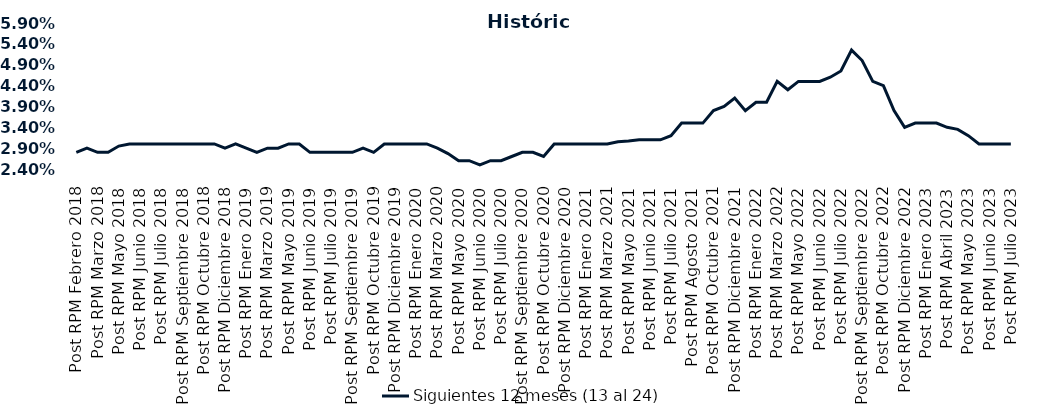
| Category | Siguientes 12 meses (13 al 24)  |
|---|---|
| Post RPM Febrero 2018 | 0.028 |
| Pre RPM Marzo 2018 | 0.029 |
| Post RPM Marzo 2018 | 0.028 |
| Pre RPM Mayo 2018 | 0.028 |
| Post RPM Mayo 2018 | 0.03 |
| Pre RPM Junio 2018 | 0.03 |
| Post RPM Junio 2018 | 0.03 |
| Pre RPM Julio 2018 | 0.03 |
| Post RPM Julio 2018 | 0.03 |
| Pre RPM Septiembre 2018 | 0.03 |
| Post RPM Septiembre 2018 | 0.03 |
| Pre RPM Octubre 2018 | 0.03 |
| Post RPM Octubre 2018 | 0.03 |
| Pre RPM Diciembre 2018 | 0.03 |
| Post RPM Diciembre 2018 | 0.029 |
| Pre RPM Enero 2019 | 0.03 |
| Post RPM Enero 2019 | 0.029 |
| Pre RPM Marzo 2019 | 0.028 |
| Post RPM Marzo 2019 | 0.029 |
| Pre RPM Mayo 2019 | 0.029 |
| Post RPM Mayo 2019 | 0.03 |
| Pre RPM Junio 2019 | 0.03 |
| Post RPM Junio 2019 | 0.028 |
| Pre RPM Julio 2019 | 0.028 |
| Post RPM Julio 2019 | 0.028 |
| Pre RPM Septiembre 2019 | 0.028 |
| Post RPM Septiembre 2019 | 0.028 |
| Pre RPM Octubre 2019 | 0.029 |
| Post RPM Octubre 2019 | 0.028 |
| Pre RPM Diciembre 2019 | 0.03 |
| Post RPM Diciembre 2019 | 0.03 |
| Pre RPM Enero 2020 | 0.03 |
| Post RPM Enero 2020 | 0.03 |
| Pre RPM Marzo 2020 | 0.03 |
| Post RPM Marzo 2020 | 0.029 |
| Pre RPM Mayo 2020 | 0.028 |
| Post RPM Mayo 2020 | 0.026 |
| Pre RPM Junio 2020 | 0.026 |
| Post RPM Junio 2020 | 0.025 |
| Pre RPM Julio 2020 | 0.026 |
| Post RPM Julio 2020 | 0.026 |
| Pre RPM Septiembre 2020 | 0.027 |
| Post RPM Septiembre 2020 | 0.028 |
| Pre RPM Octubre 2020 | 0.028 |
| Post RPM Octubre 2020 | 0.027 |
| Pre RPM Diciembre 2020 | 0.03 |
| Post RPM Diciembre 2020 | 0.03 |
| Pre RPM Enero 2021 | 0.03 |
| Post RPM Enero 2021 | 0.03 |
| Pre RPM Marzo 2021 | 0.03 |
| Post RPM Marzo 2021 | 0.03 |
| Pre RPM Mayo 2021 | 0.031 |
| Post RPM Mayo 2021 | 0.031 |
| Pre RPM Junio 2021 | 0.031 |
| Post RPM Junio 2021 | 0.031 |
| Pre RPM Julio 2021 | 0.031 |
| Post RPM Julio 2021 | 0.032 |
| Pre RPM Agosto 2021 | 0.035 |
| Post RPM Agosto 2021 | 0.035 |
| Pre RPM Octubre 2021 | 0.035 |
| Post RPM Octubre 2021 | 0.038 |
| Pre RPM Diciembre 2021 | 0.039 |
| Post RPM Diciembre 2021 | 0.041 |
| Pre RPM Enero 2022 | 0.038 |
| Post RPM Enero 2022 | 0.04 |
| Pre RPM Marzo 2022 | 0.04 |
| Post RPM Marzo 2022 | 0.045 |
| Pre RPM Mayo 2022 | 0.043 |
| Post RPM Mayo 2022 | 0.045 |
| Pre RPM Junio 2022 | 0.045 |
| Post RPM Junio 2022 | 0.045 |
| Pre RPM Julio 2022 | 0.046 |
| Post RPM Julio 2022 | 0.048 |
| Pre RPM Septiembre 2022 | 0.052 |
| Post RPM Septiembre 2022 | 0.05 |
| Pre RPM Octubre 2022 | 0.045 |
| Post RPM Octubre 2022 | 0.044 |
| Pre RPM Diciembre 2022 | 0.038 |
| Post RPM Diciembre 2022 | 0.034 |
| Pre RPM Enero 2023 | 0.035 |
| Post RPM Enero 2023 | 0.035 |
| Pre RPM Abril 2023 | 0.035 |
| Post RPM Abril 2023 | 0.034 |
| Pre RPM Mayo 2023 | 0.034 |
| Post RPM Mayo 2023 | 0.032 |
| Pre RPM Junio 2023 | 0.03 |
| Post RPM Junio 2023 | 0.03 |
| Pre RPM Julio 2023 | 0.03 |
| Post RPM Julio 2023 | 0.03 |